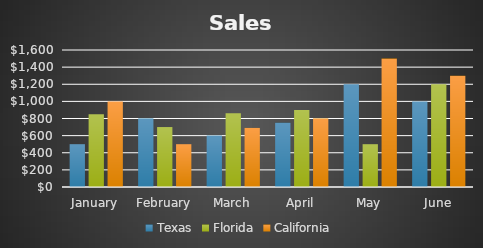
| Category | Texas | Florida | California |
|---|---|---|---|
| January | 500 | 850 | 1000 |
| February | 800 | 700 | 500 |
| March | 600 | 860 | 690 |
| April | 750 | 900 | 800 |
| May | 1200 | 500 | 1500 |
| June | 1000 | 1200 | 1300 |